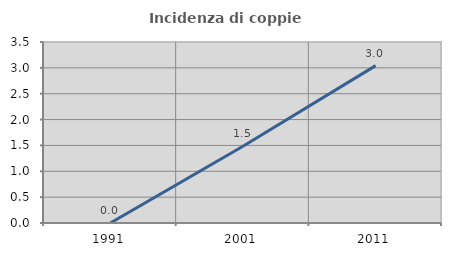
| Category | Incidenza di coppie miste |
|---|---|
| 1991.0 | 0 |
| 2001.0 | 1.483 |
| 2011.0 | 3.043 |